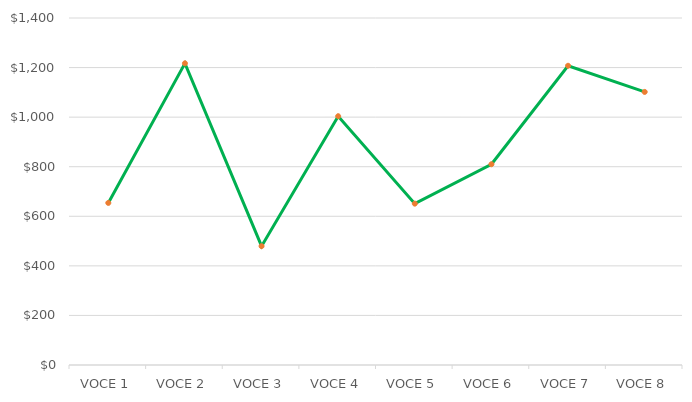
| Category | Series 1 |
|---|---|
| VOCE 1 | 653.975 |
| VOCE 2 | 1217.065 |
| VOCE 3 | 479.5 |
| VOCE 4 | 1003.75 |
| VOCE 5 | 651 |
| VOCE 6 | 810 |
| VOCE 7 | 1207.25 |
| VOCE 8 | 1101.76 |